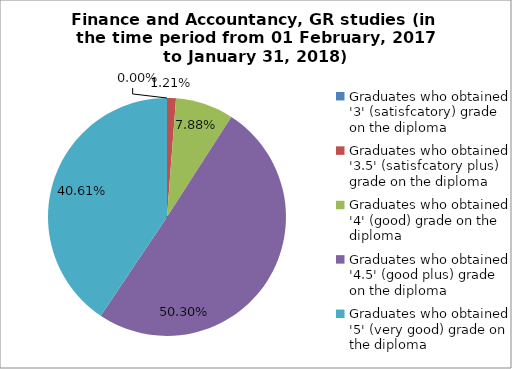
| Category | Series 1 |
|---|---|
| Graduates who obtained '3' (satisfcatory) grade on the diploma | 0 |
| Graduates who obtained '3.5' (satisfcatory plus) grade on the diploma | 1.212 |
| Graduates who obtained '4' (good) grade on the diploma | 7.879 |
| Graduates who obtained '4.5' (good plus) grade on the diploma | 50.303 |
| Graduates who obtained '5' (very good) grade on the diploma | 40.606 |